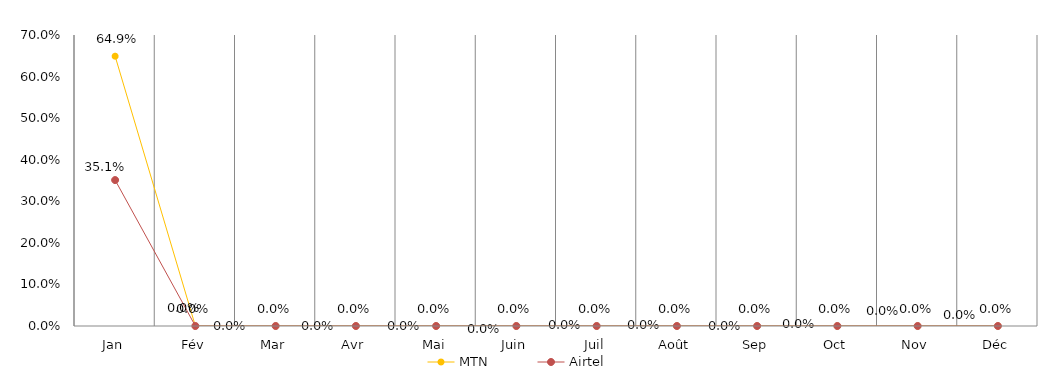
| Category | MTN | Airtel |
|---|---|---|
| Jan | 0.649 | 0.351 |
| Fév | 0 | 0 |
| Mar | 0 | 0 |
| Avr | 0 | 0 |
| Mai | 0 | 0 |
| Juin | 0 | 0 |
| Juil | 0 | 0 |
| Août | 0 | 0 |
| Sep | 0 | 0 |
| Oct | 0 | 0 |
| Nov | 0 | 0 |
| Déc | 0 | 0 |